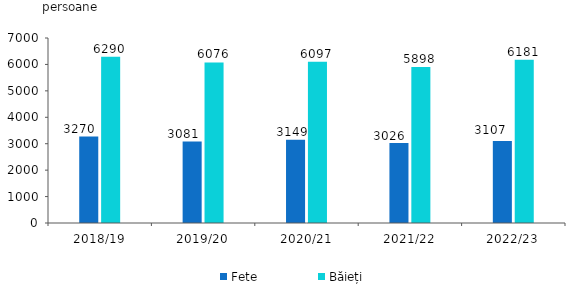
| Category | Fete  | Băieți |
|---|---|---|
| 2018/19 | 3270 | 6290 |
| 2019/20 | 3081 | 6076 |
| 2020/21 | 3149 | 6097 |
| 2021/22 | 3026 | 5898 |
| 2022/23 | 3107 | 6181 |